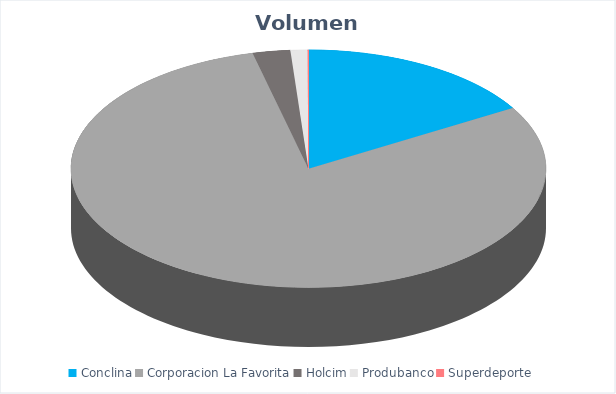
| Category | VOLUMEN ($USD) |
|---|---|
| Conclina | 30226 |
| Corporacion La Favorita | 146505.22 |
| Holcim | 4690 |
| Produbanco | 2118.88 |
| Superdeporte | 121 |